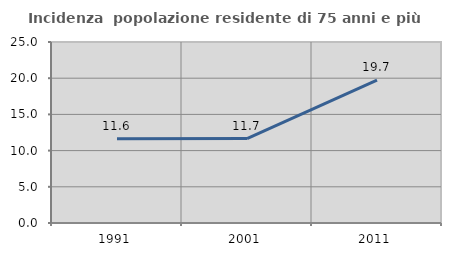
| Category | Incidenza  popolazione residente di 75 anni e più |
|---|---|
| 1991.0 | 11.64 |
| 2001.0 | 11.656 |
| 2011.0 | 19.718 |